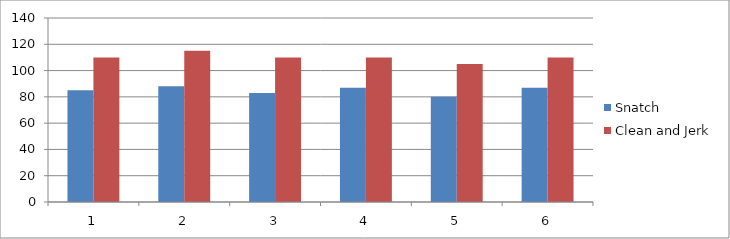
| Category | Snatch | Clean and Jerk |
|---|---|---|
| 0 | 85 | 110 |
| 1 | 88 | 115 |
| 2 | 83 | 110 |
| 3 | 87 | 110 |
| 4 | 80 | 105 |
| 5 | 87 | 110 |